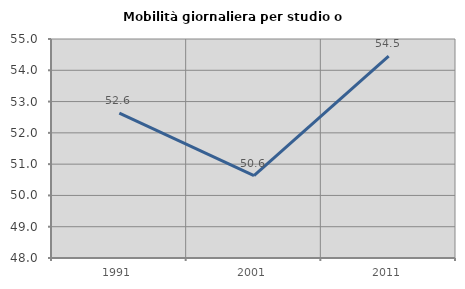
| Category | Mobilità giornaliera per studio o lavoro |
|---|---|
| 1991.0 | 52.634 |
| 2001.0 | 50.632 |
| 2011.0 | 54.454 |